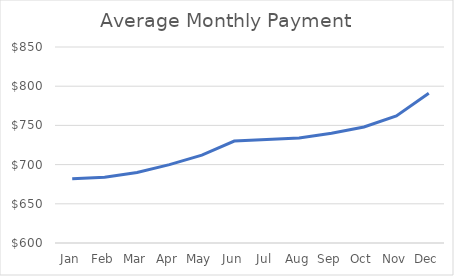
| Category | Series 0 |
|---|---|
| Jan | 682 |
| Feb | 684 |
| Mar | 690 |
| Apr | 700 |
| May | 712 |
| Jun | 730 |
| Jul | 732 |
| Aug | 734 |
| Sep | 740 |
| Oct | 748 |
| Nov | 762 |
| Dec | 791 |